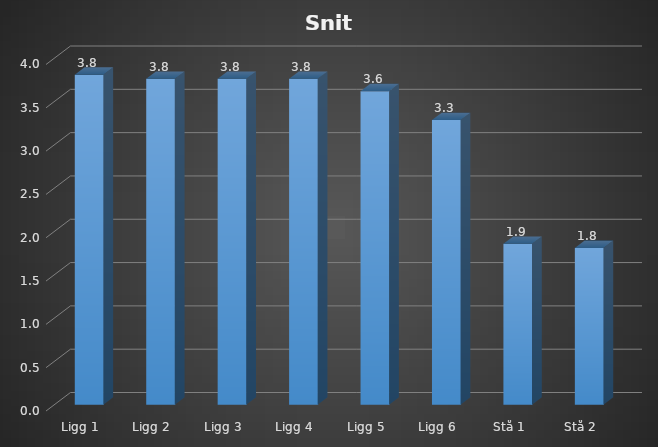
| Category | Snitt |
|---|---|
| Ligg 1 | 3.81 |
| Ligg 2 | 3.762 |
| Ligg 3 | 3.762 |
| Ligg 4 | 3.762 |
| Ligg 5 | 3.619 |
| Ligg 6 | 3.286 |
| Stå 1 | 1.857 |
| Stå 2 | 1.81 |